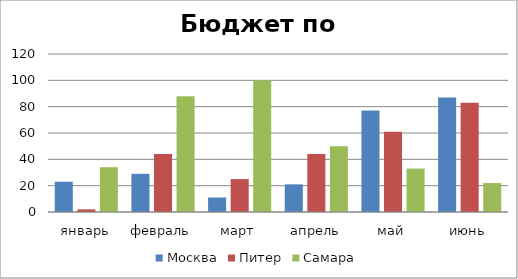
| Category | Москва | Питер | Самара |
|---|---|---|---|
| январь | 23 | 2 | 34 |
| февраль | 29 | 44 | 88 |
| март | 11 | 25 | 100 |
| апрель | 21 | 44 | 50 |
| май | 77 | 61 | 33 |
| июнь | 87 | 83 | 22 |